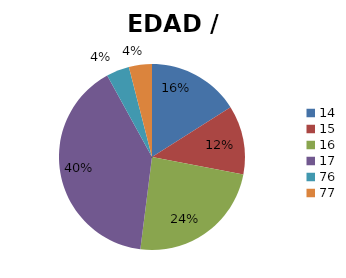
| Category | EDAD / DETENIDOS |
|---|---|
| 14.0 | 4 |
| 15.0 | 3 |
| 16.0 | 6 |
| 17.0 | 10 |
| 76.0 | 1 |
| 77.0 | 1 |